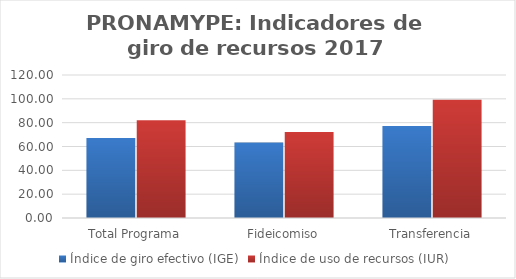
| Category | Índice de giro efectivo (IGE) | Índice de uso de recursos (IUR)  |
|---|---|---|
| Total Programa | 67.118 | 82.062 |
| Fideicomiso | 63.315 | 72.26 |
| Transferencia | 77.143 | 99.216 |